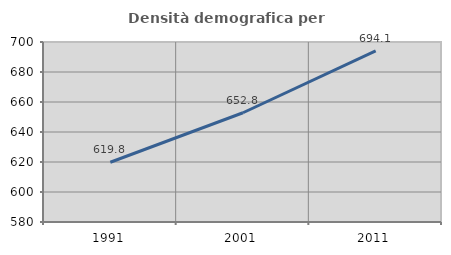
| Category | Densità demografica |
|---|---|
| 1991.0 | 619.846 |
| 2001.0 | 652.83 |
| 2011.0 | 694.06 |